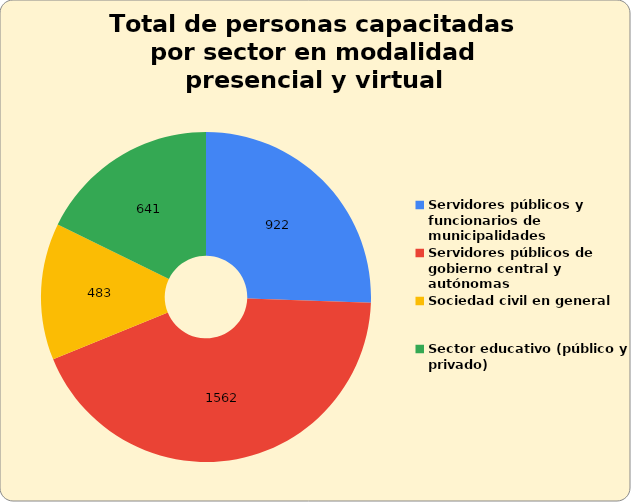
| Category | Cantidad de personas capacitadas por sector  en modalidad presencial  |
|---|---|
| Servidores públicos y funcionarios de municipalidades | 922 |
| Servidores públicos de gobierno central y autónomas | 1562 |
| Sociedad civil en general | 483 |
| Sector educativo (público y privado) | 641 |